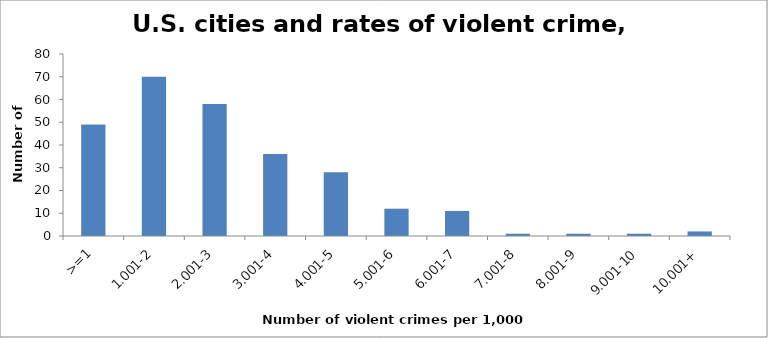
| Category | Frequency |
|---|---|
| >=1 | 49 |
| 1.001-2 | 70 |
| 2.001-3 | 58 |
| 3.001-4 | 36 |
| 4.001-5 | 28 |
| 5.001-6 | 12 |
| 6.001-7 | 11 |
| 7.001-8 | 1 |
| 8.001-9 | 1 |
| 9.001-10 | 1 |
| 10.001+ | 2 |